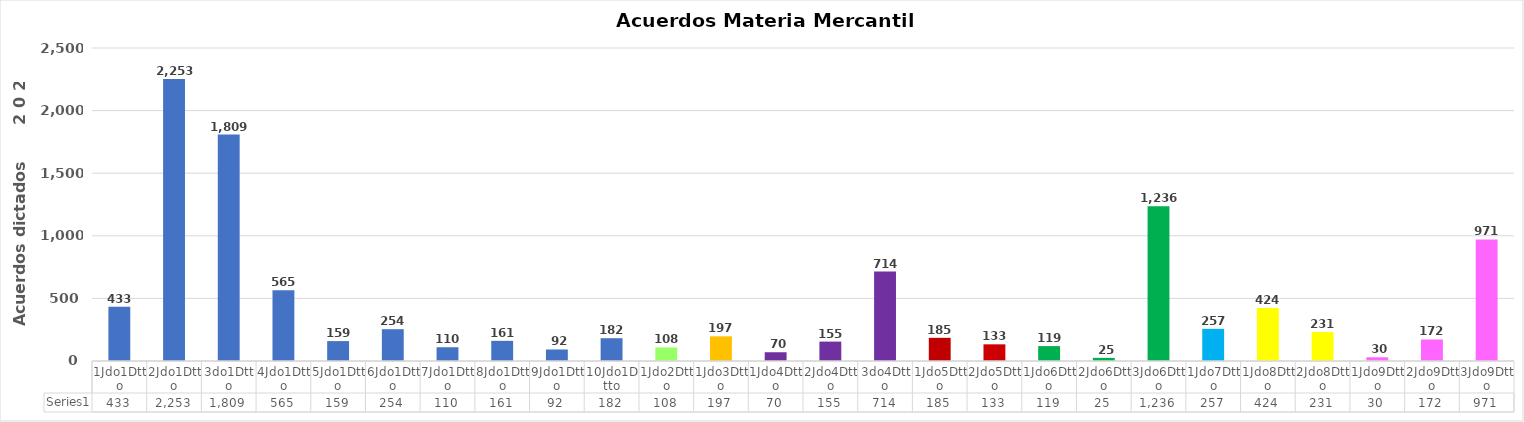
| Category | Series 0 |
|---|---|
| 1Jdo1Dtto | 433 |
| 2Jdo1Dtto | 2253 |
| 3do1Dtto | 1809 |
| 4Jdo1Dtto | 565 |
| 5Jdo1Dtto | 159 |
| 6Jdo1Dtto | 254 |
| 7Jdo1Dtto | 110 |
| 8Jdo1Dtto | 161 |
| 9Jdo1Dtto | 92 |
| 10Jdo1Dtto | 182 |
| 1Jdo2Dtto | 108 |
| 1Jdo3Dtto | 197 |
| 1Jdo4Dtto | 70 |
| 2Jdo4Dtto | 155 |
| 3do4Dtto | 714 |
| 1Jdo5Dtto | 185 |
| 2Jdo5Dtto | 133 |
| 1Jdo6Dtto | 119 |
| 2Jdo6Dtto | 25 |
| 3Jdo6Dtto | 1236 |
| 1Jdo7Dtto | 257 |
| 1Jdo8Dtto | 424 |
| 2Jdo8Dtto | 231 |
| 1Jdo9Dtto | 30 |
| 2Jdo9Dtto | 172 |
| 3Jdo9Dtto | 971 |